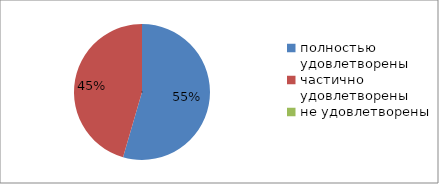
| Category | Series 0 |
|---|---|
| полностью удовлетворены | 54.5 |
| частично удовлетворены | 45.5 |
| не удовлетворены | 0 |